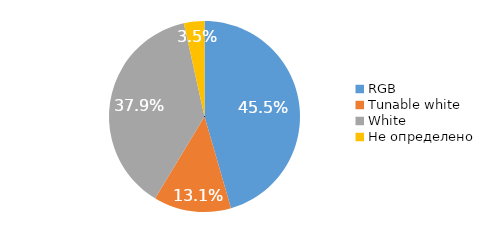
| Category | Series 0 |
|---|---|
| RGB | 0.455 |
| Tunable white | 0.131 |
| White | 0.379 |
| Не определено | 0.035 |